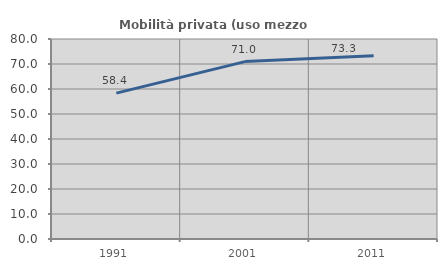
| Category | Mobilità privata (uso mezzo privato) |
|---|---|
| 1991.0 | 58.354 |
| 2001.0 | 70.953 |
| 2011.0 | 73.315 |